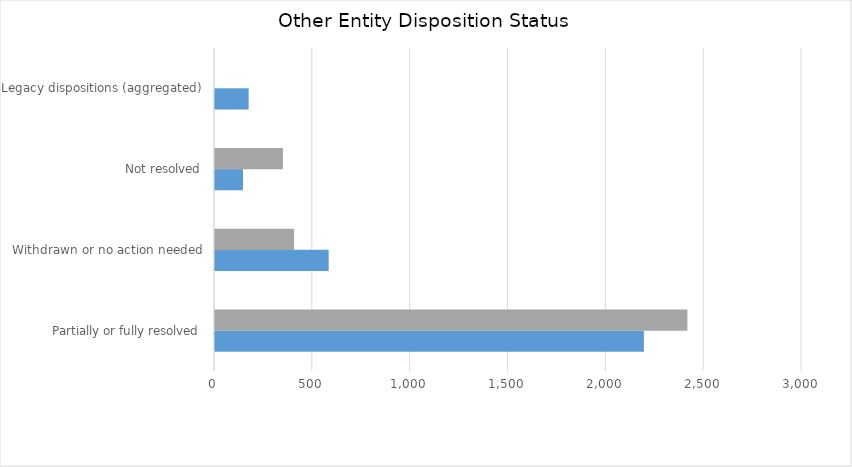
| Category | Other 
FFY 2019 | Other 
FFY 2020 |
|---|---|---|
| Partially or fully resolved | 2192 | 2414 |
| Withdrawn or no action needed | 581 | 404 |
| Not resolved | 143 | 347 |
| Legacy dispositions (aggregated) | 172 | 0 |